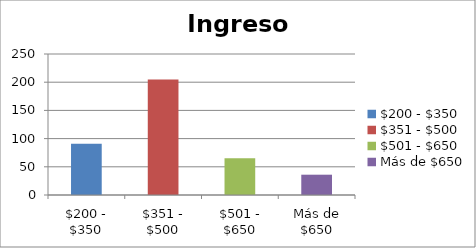
| Category | Ingresos |
|---|---|
| $200 - $350 | 91 |
| $351 - $500 | 205 |
| $501 - $650 | 65 |
| Más de $650 | 36 |